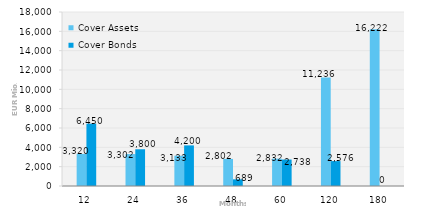
| Category | Cover Assets | Cover Bonds |
|---|---|---|
| 12.0 | 3320.013 | 6449.98 |
| 24.0 | 3301.795 | 3800 |
| 36.0 | 3132.546 | 4200 |
| 48.0 | 2801.881 | 689.444 |
| 60.0 | 2831.731 | 2738 |
| 120.0 | 11236.447 | 2576.41 |
| 180.0 | 16221.954 | 0 |